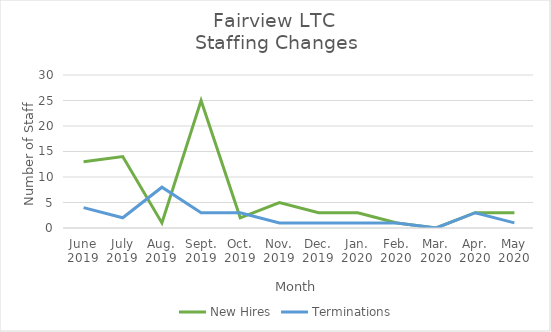
| Category | New Hires | Terminations |
|---|---|---|
| June
2019 | 13 | 4 |
| July
2019 | 14 | 2 |
| Aug.
2019 | 1 | 8 |
| Sept.
2019 | 25 | 3 |
| Oct.
2019 | 2 | 3 |
| Nov.
2019 | 5 | 1 |
| Dec.
2019 | 3 | 1 |
| Jan.
2020 | 3 | 1 |
| Feb.
2020 | 1 | 1 |
| Mar.
2020 | 0 | 0 |
| Apr.
2020 | 3 | 3 |
| May
2020 | 3 | 1 |